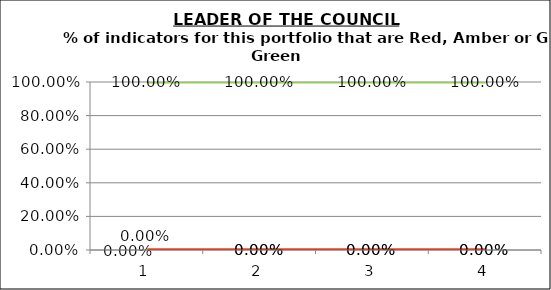
| Category | Green | Amber | Red |
|---|---|---|---|
| 0 | 1 | 0 | 0 |
| 1 | 1 | 0 | 0 |
| 2 | 1 | 0 | 0 |
| 3 | 1 | 0 | 0 |